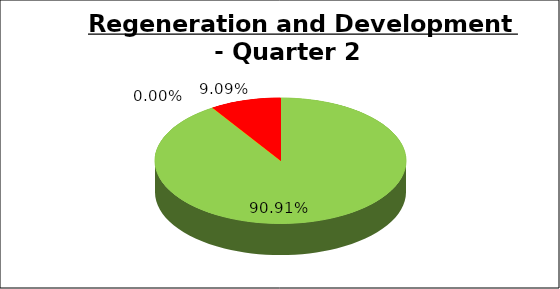
| Category | Q2 |
|---|---|
| Green | 0.909 |
| Amber | 0 |
| Red | 0.091 |